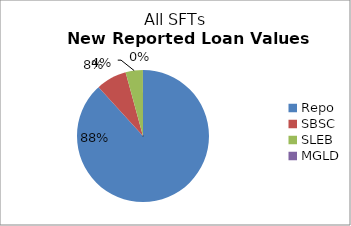
| Category | Series 1 |
|---|---|
| Repo | 14526341.701 |
| SBSC | 1232555.031 |
| SLEB | 698205.142 |
| MGLD | 1710.842 |